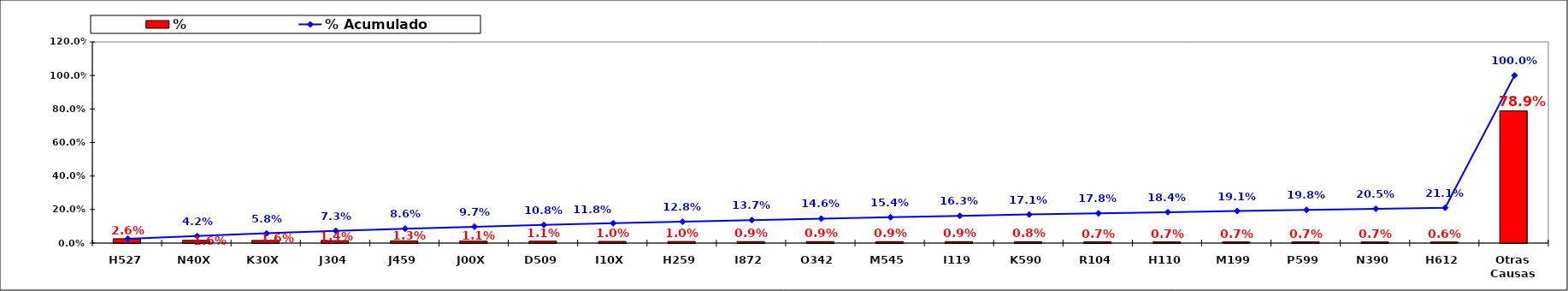
| Category | % |
|---|---|
| H527 | 0.026 |
| N40X | 0.016 |
| K30X | 0.016 |
| J304 | 0.014 |
| J459 | 0.013 |
| J00X | 0.011 |
| D509 | 0.011 |
| I10X | 0.01 |
| H259 | 0.01 |
| I872 | 0.009 |
| O342 | 0.009 |
| M545 | 0.009 |
| I119 | 0.009 |
| K590 | 0.008 |
| R104 | 0.007 |
| H110 | 0.007 |
| M199 | 0.007 |
| P599 | 0.007 |
| N390 | 0.007 |
| H612 | 0.006 |
| Otras Causas | 0.789 |